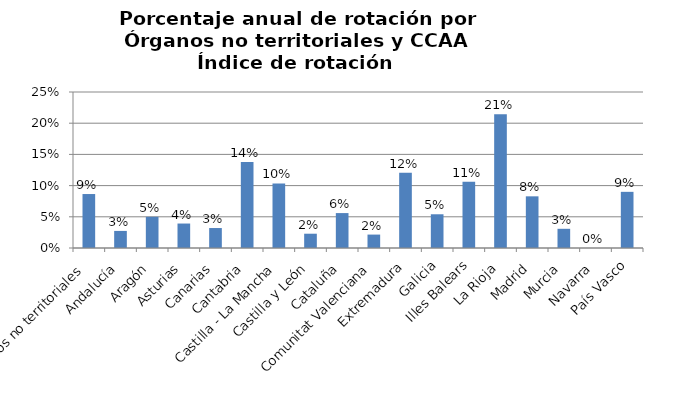
| Category | Porcentaje |
|---|---|
| Órganos no territoriales | 0.086 |
| Andalucía | 0.027 |
| Aragón | 0.05 |
| Asturias | 0.039 |
| Canarias | 0.032 |
| Cantabria | 0.138 |
| Castilla - La Mancha | 0.103 |
| Castilla y León | 0.023 |
| Cataluña | 0.056 |
| Comunitat Valenciana | 0.022 |
| Extremadura | 0.121 |
| Galicia | 0.054 |
| Illes Balears | 0.106 |
| La Rioja | 0.214 |
| Madrid | 0.083 |
| Murcia | 0.031 |
| Navarra | 0 |
| País Vasco | 0.09 |